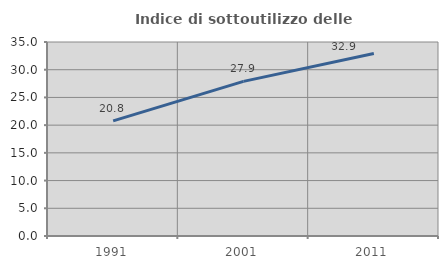
| Category | Indice di sottoutilizzo delle abitazioni  |
|---|---|
| 1991.0 | 20.767 |
| 2001.0 | 27.891 |
| 2011.0 | 32.913 |